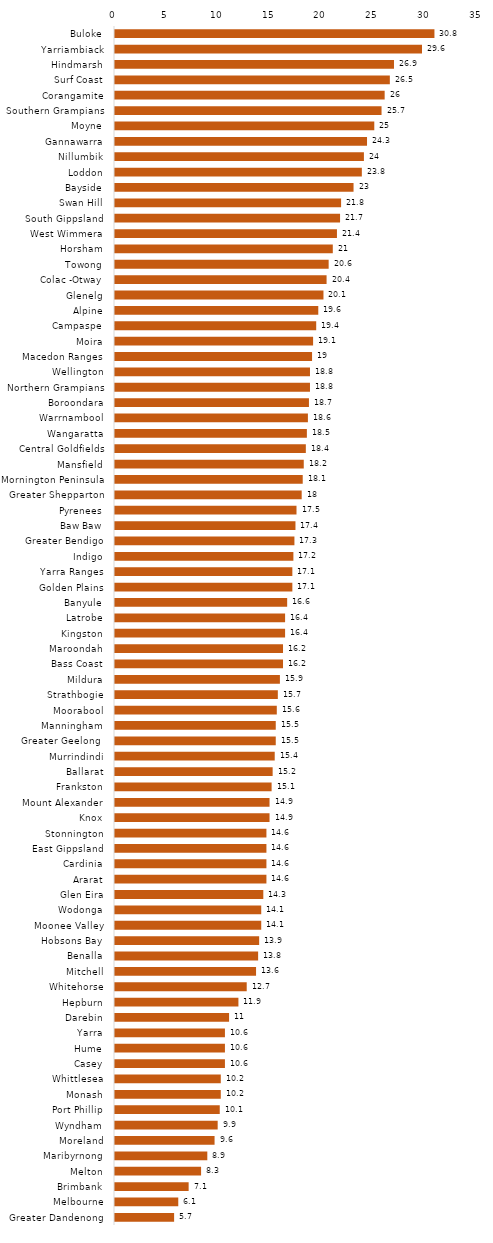
| Category | Series 0 |
|---|---|
| Buloke | 30.8 |
| Yarriambiack | 29.6 |
| Hindmarsh | 26.9 |
| Surf Coast | 26.5 |
| Corangamite | 26 |
| Southern Grampians | 25.7 |
| Moyne | 25 |
| Gannawarra | 24.3 |
| Nillumbik | 24 |
| Loddon | 23.8 |
| Bayside | 23 |
| Swan Hill | 21.8 |
| South Gippsland | 21.7 |
| West Wimmera | 21.4 |
| Horsham | 21 |
| Towong | 20.6 |
| Colac -Otway | 20.4 |
| Glenelg | 20.1 |
| Alpine | 19.6 |
| Campaspe | 19.4 |
| Moira | 19.1 |
| Macedon Ranges | 19 |
| Wellington | 18.8 |
| Northern Grampians | 18.8 |
| Boroondara | 18.7 |
| Warrnambool | 18.6 |
| Wangaratta | 18.5 |
| Central Goldfields | 18.4 |
| Mansfield | 18.2 |
| Mornington Peninsula | 18.1 |
| Greater Shepparton | 18 |
| Pyrenees | 17.5 |
| Baw Baw | 17.4 |
| Greater Bendigo | 17.3 |
| Indigo | 17.2 |
| Yarra Ranges | 17.1 |
| Golden Plains | 17.1 |
| Banyule | 16.6 |
| Latrobe | 16.4 |
| Kingston | 16.4 |
| Maroondah | 16.2 |
| Bass Coast | 16.2 |
| Mildura | 15.9 |
| Strathbogie | 15.7 |
| Moorabool | 15.6 |
| Manningham | 15.5 |
| Greater Geelong  | 15.5 |
| Murrindindi | 15.4 |
| Ballarat | 15.2 |
| Frankston | 15.1 |
| Mount Alexander | 14.9 |
| Knox | 14.9 |
| Stonnington | 14.6 |
| East Gippsland | 14.6 |
| Cardinia | 14.6 |
| Ararat | 14.6 |
| Glen Eira | 14.3 |
| Wodonga | 14.1 |
| Moonee Valley | 14.1 |
| Hobsons Bay | 13.9 |
| Benalla | 13.8 |
| Mitchell | 13.6 |
| Whitehorse | 12.7 |
| Hepburn | 11.9 |
| Darebin | 11 |
| Yarra | 10.6 |
| Hume | 10.6 |
| Casey | 10.6 |
| Whittlesea | 10.2 |
| Monash | 10.2 |
| Port Phillip | 10.1 |
| Wyndham | 9.9 |
| Moreland | 9.6 |
| Maribyrnong | 8.9 |
| Melton | 8.3 |
| Brimbank | 7.1 |
| Melbourne | 6.1 |
| Greater Dandenong | 5.7 |